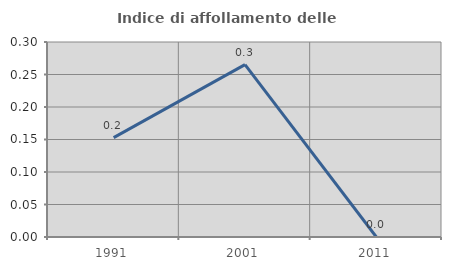
| Category | Indice di affollamento delle abitazioni  |
|---|---|
| 1991.0 | 0.153 |
| 2001.0 | 0.265 |
| 2011.0 | 0 |